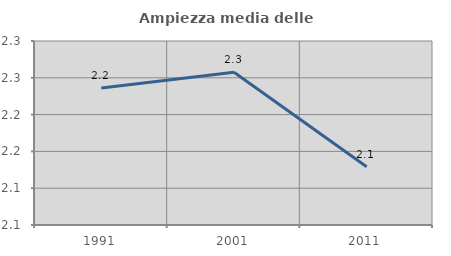
| Category | Ampiezza media delle famiglie |
|---|---|
| 1991.0 | 2.236 |
| 2001.0 | 2.258 |
| 2011.0 | 2.129 |